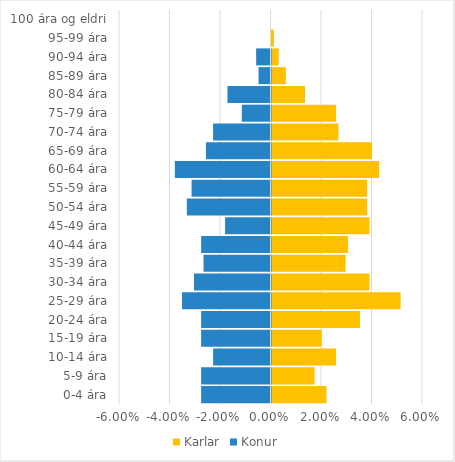
| Category | Karlar | Konur |
|---|---|---|
| 0-4 ára | 0.022 | -0.027 |
| 5-9 ára | 0.017 | -0.027 |
| 10-14 ára | 0.026 | -0.023 |
| 15-19 ára | 0.02 | -0.027 |
| 20-24 ára | 0.035 | -0.027 |
| 25-29 ára | 0.051 | -0.035 |
| 30-34 ára | 0.039 | -0.03 |
| 35-39 ára | 0.029 | -0.027 |
| 40-44 ára | 0.03 | -0.027 |
| 45-49 ára | 0.039 | -0.018 |
| 50-54 ára | 0.038 | -0.033 |
| 55-59 ára | 0.038 | -0.031 |
| 60-64 ára | 0.043 | -0.038 |
| 65-69 ára | 0.04 | -0.026 |
| 70-74 ára | 0.027 | -0.023 |
| 75-79 ára | 0.026 | -0.011 |
| 80-84 ára | 0.013 | -0.017 |
| 85-89 ára | 0.006 | -0.005 |
| 90-94 ára | 0.003 | -0.006 |
| 95-99 ára | 0.001 | 0 |
| 100 ára og eldri | 0 | 0 |